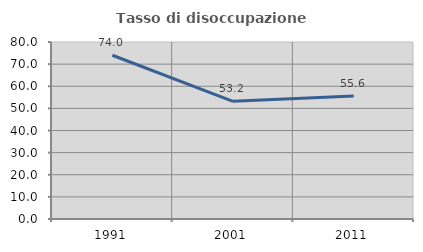
| Category | Tasso di disoccupazione giovanile  |
|---|---|
| 1991.0 | 74 |
| 2001.0 | 53.191 |
| 2011.0 | 55.556 |